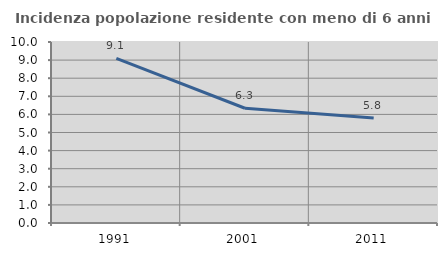
| Category | Incidenza popolazione residente con meno di 6 anni |
|---|---|
| 1991.0 | 9.092 |
| 2001.0 | 6.34 |
| 2011.0 | 5.796 |